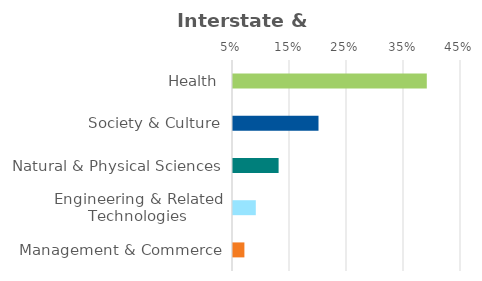
| Category | Series 0 |
|---|---|
| Health | 0.39 |
| Society & Culture | 0.2 |
| Natural & Physical Sciences | 0.13 |
| Engineering & Related Technologies | 0.09 |
| Management & Commerce | 0.07 |